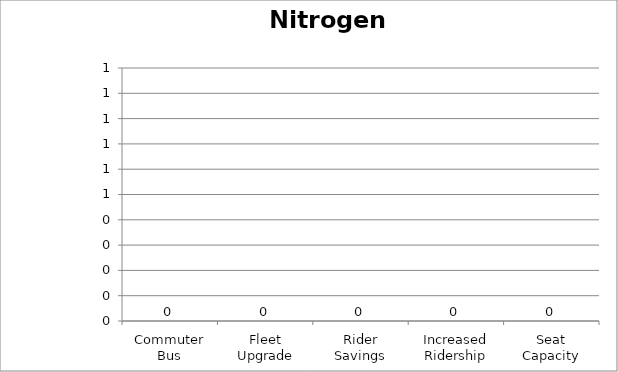
| Category | Nitrogen Oxides |
|---|---|
| Commuter Bus | 0 |
| Fleet Upgrade | 0 |
| Rider Savings | 0 |
| Increased Ridership | 0 |
| Seat Capacity | 0 |